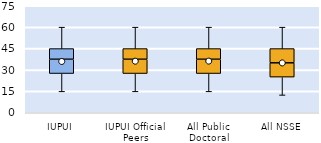
| Category | 25th | 50th | 75th |
|---|---|---|---|
| IUPUI | 27.5 | 10 | 7.5 |
| IUPUI Official Peers | 27.5 | 10 | 7.5 |
| All Public Doctoral | 27.5 | 10 | 7.5 |
| All NSSE | 25 | 10 | 10 |